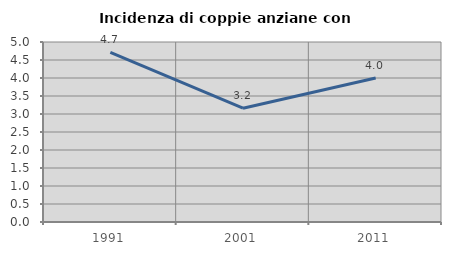
| Category | Incidenza di coppie anziane con figli |
|---|---|
| 1991.0 | 4.714 |
| 2001.0 | 3.161 |
| 2011.0 | 4 |